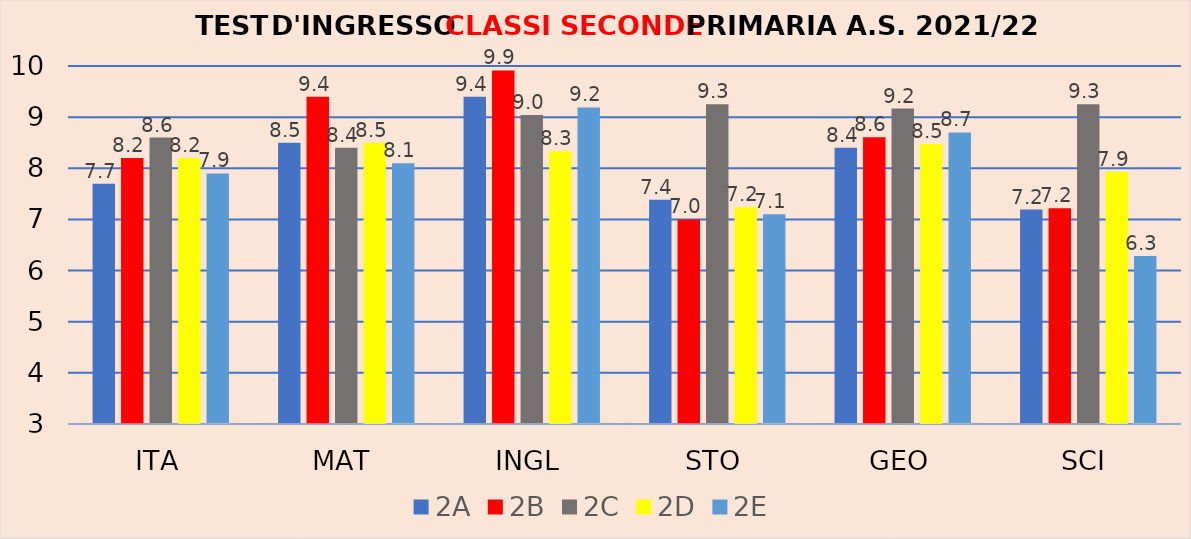
| Category | 2A | 2B | 2C | 2D | 2E |
|---|---|---|---|---|---|
| ITA | 7.7 | 8.2 | 8.6 | 8.2 | 7.9 |
| MAT | 8.5 | 9.4 | 8.4 | 8.5 | 8.1 |
| INGL | 9.4 | 9.913 | 9.042 | 8.333 | 9.19 |
| STO | 7.385 | 7 | 9.25 | 7.238 | 7.1 |
| GEO | 8.4 | 8.609 | 9.167 | 8.476 | 8.7 |
| SCI | 7.192 | 7.217 | 9.25 | 7.931 | 6.286 |